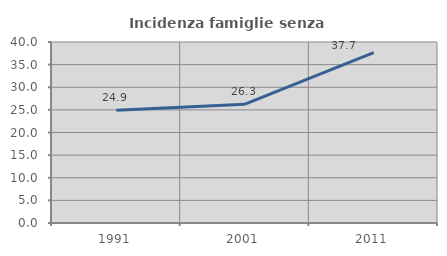
| Category | Incidenza famiglie senza nuclei |
|---|---|
| 1991.0 | 24.918 |
| 2001.0 | 26.259 |
| 2011.0 | 37.654 |